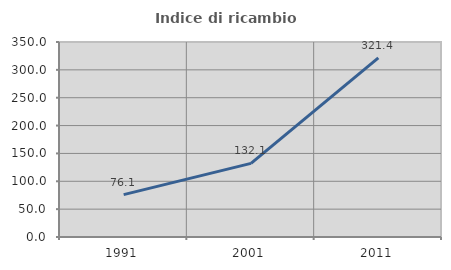
| Category | Indice di ricambio occupazionale  |
|---|---|
| 1991.0 | 76.074 |
| 2001.0 | 132.131 |
| 2011.0 | 321.351 |